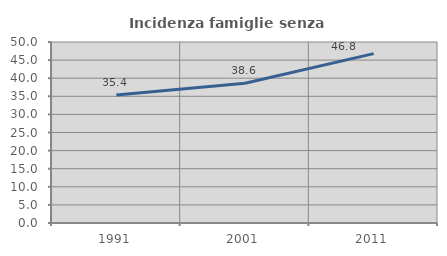
| Category | Incidenza famiglie senza nuclei |
|---|---|
| 1991.0 | 35.37 |
| 2001.0 | 38.602 |
| 2011.0 | 46.779 |